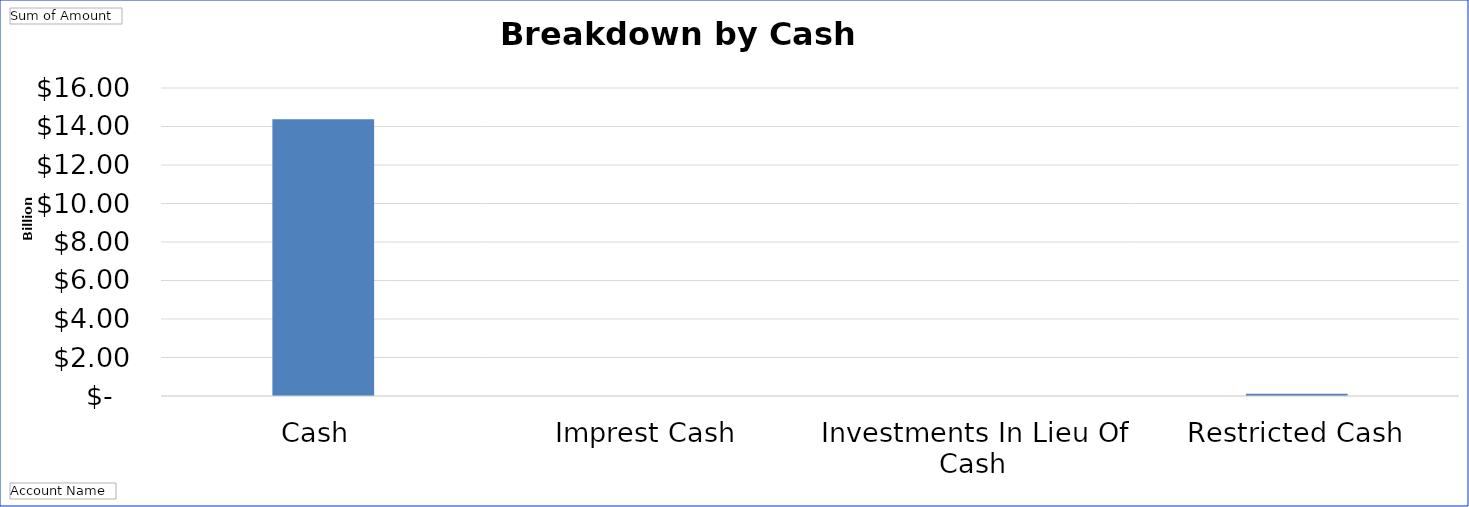
| Category | Total |
|---|---|
| Cash  | 14382091359.34 |
| Imprest Cash | 693047.33 |
| Investments In Lieu Of Cash | 986080 |
| Restricted Cash | 111924768.11 |